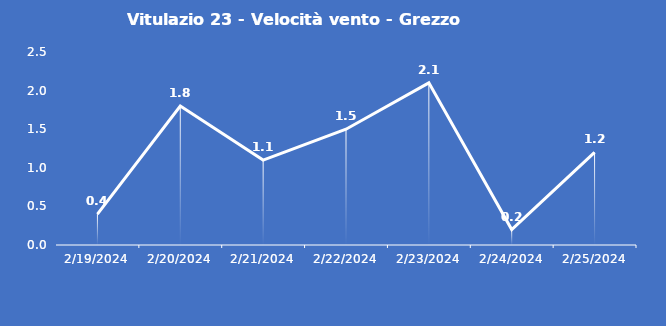
| Category | Vitulazio 23 - Velocità vento - Grezzo (m/s) |
|---|---|
| 2/19/24 | 0.4 |
| 2/20/24 | 1.8 |
| 2/21/24 | 1.1 |
| 2/22/24 | 1.5 |
| 2/23/24 | 2.1 |
| 2/24/24 | 0.2 |
| 2/25/24 | 1.2 |